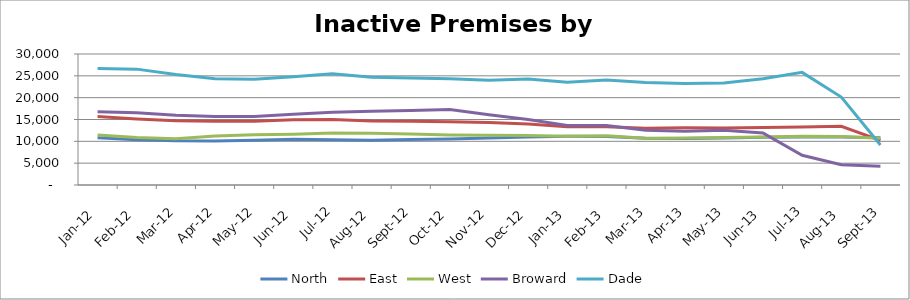
| Category | North | East | West | Broward | Dade |
|---|---|---|---|---|---|
| 2012-01-01 | 10844 | 15671 | 11441 | 16782 | 26699 |
| 2012-02-01 | 10371 | 15112 | 10886 | 16571 | 26534 |
| 2012-03-01 | 10106 | 14723 | 10586 | 15956 | 25311 |
| 2012-04-01 | 10100 | 14582 | 11223 | 15680 | 24350 |
| 2012-05-01 | 10241 | 14620 | 11503 | 15699 | 24237 |
| 2012-06-01 | 10491 | 14918 | 11648 | 16211 | 24800 |
| 2012-07-01 | 10341 | 14972 | 11903 | 16663 | 25453 |
| 2012-08-01 | 10248 | 14676 | 11843 | 16863 | 24691 |
| 2012-09-01 | 10446 | 14587 | 11651 | 17064 | 24481 |
| 2012-10-01 | 10531 | 14463 | 11478 | 17276 | 24360 |
| 2012-11-01 | 10757 | 14294 | 11395 | 16103 | 24003 |
| 2012-12-01 | 11013 | 13993 | 11360 | 15013 | 24254 |
| 2013-01-01 | 11151 | 13329 | 11188 | 13611 | 23534 |
| 2013-02-01 | 11128 | 13360 | 11288 | 13611 | 24051 |
| 2013-03-01 | 10706 | 12976 | 10733 | 12546 | 23468 |
| 2013-04-01 | 10669 | 13108 | 10763 | 12335 | 23219 |
| 2013-05-01 | 10758 | 13045 | 10901 | 12553 | 23335 |
| 2013-06-01 | 10913 | 13165 | 10989 | 11932 | 24344 |
| 2013-07-01 | 10968 | 13290 | 11147 | 6797 | 25792 |
| 2013-08-01 | 10992 | 13440 | 11093 | 4658 | 20144 |
| 2013-09-01 | 10794 | 10205 | 10705 | 4298 | 9152 |